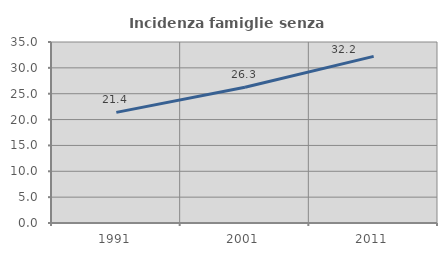
| Category | Incidenza famiglie senza nuclei |
|---|---|
| 1991.0 | 21.394 |
| 2001.0 | 26.261 |
| 2011.0 | 32.225 |